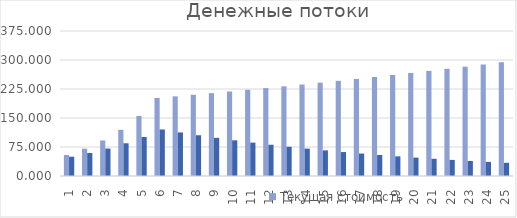
| Category | Текущая стоимость | Дисконтированная стоимость |
|---|---|---|
| 1 | 54.379 | 49.889 |
| 2 | 70.693 | 59.501 |
| 3 | 91.901 | 70.964 |
| 4 | 119.471 | 84.636 |
| 5 | 155.312 | 100.942 |
| 6 | 201.905 | 120.39 |
| 7 | 205.944 | 112.658 |
| 8 | 210.062 | 105.423 |
| 9 | 214.264 | 98.653 |
| 10 | 218.549 | 92.317 |
| 11 | 222.92 | 86.389 |
| 12 | 227.378 | 80.841 |
| 13 | 231.926 | 75.649 |
| 14 | 236.564 | 70.791 |
| 15 | 241.296 | 66.245 |
| 16 | 246.122 | 61.991 |
| 17 | 251.044 | 58.01 |
| 18 | 256.065 | 54.284 |
| 19 | 261.186 | 50.798 |
| 20 | 266.41 | 47.536 |
| 21 | 271.738 | 44.483 |
| 22 | 277.173 | 41.626 |
| 23 | 282.716 | 38.953 |
| 24 | 288.371 | 36.451 |
| 25 | 294.138 | 34.111 |